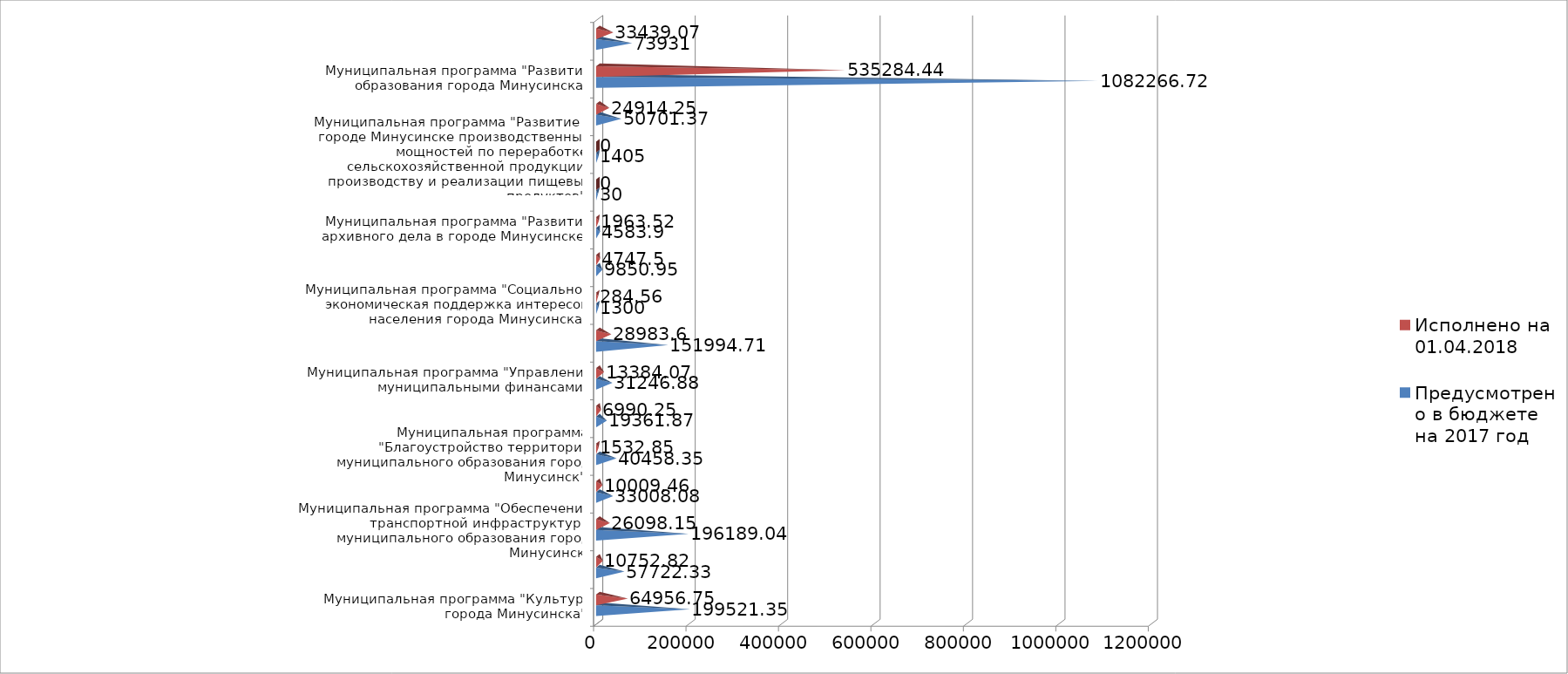
| Category | Предусмотрено в бюджете на 2017 год | Исполнено на 01.04.2018 |
|---|---|---|
| Муниципальная программа "Культура города Минусинска" | 199521.35 | 64956.75 |
| Муниципальная программа "Реформирование и модернизация жилищно-коммунального хозяйства и повышение энергетической эффективности муниципального образования город Минусинск" | 57722.33 | 10752.82 |
| Муниципальная программа "Обеспечение транспортной инфраструктуры муниципального образования город Минусинск | 196189.04 | 26098.15 |
| Муниципальная программа "Обеспечение жизнедеятельности территории " | 33008.08 | 10009.46 |
| Муниципальная программа "Благоустройство территории муниципального образования город Минусинск" | 40458.35 | 1532.85 |
| Муниципальная программа "Молодежь Минусинска" | 19361.87 | 6990.25 |
| Муниципальная программа "Управление муниципальными финансами" | 31246.88 | 13384.07 |
| Муниципальная программа "Эффективное управление муниципальным имуществом города Минусинска" | 151994.71 | 28983.6 |
| Муниципальная программа "Социально - экономическая поддержка интересов населения города Минусинска" | 1300 | 284.56 |
| Муниципальная программа "Управление земельно-имущественными отношениями на территории города Минусинска" | 9850.95 | 4747.5 |
| Муниципальная программа "Развитие архивного дела в городе Минусинске" | 4583.9 | 1963.52 |
| Муниципальная программа "Безопасный город" | 30 | 0 |
| Муниципальная программа "Развитие в городе Минусинске производственных мощностей по переработке сельскохозяйственной продукции, производству и реализации пищевых продуктов" | 1405 | 0 |
| Муниципальная программа "Физическая культура и спорт в муниципальном образовании город Минусинск" | 50701.37 | 24914.25 |
| Муниципальная программа "Развитие образования города Минусинска" | 1082266.72 | 535284.44 |
| Муниципальная программа "Система социальной защиты населения города Минусинска" | 73931 | 33439.07 |